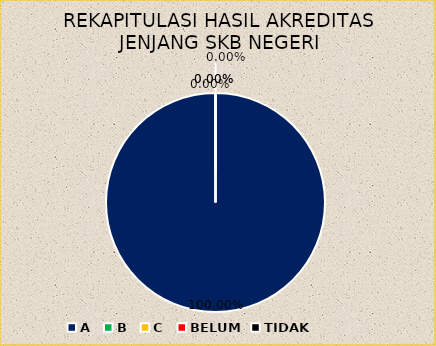
| Category | REKAPITULASI HASIL AKREDITASI JENJANG SKB NEGERI |
|---|---|
| A | 1 |
| B | 0 |
| C | 0 |
| BELUM | 0 |
| TIDAK | 0 |